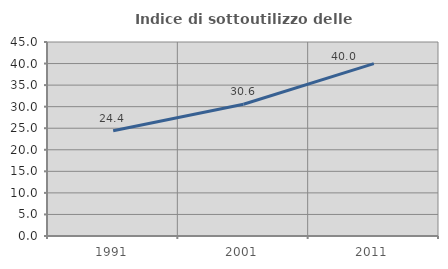
| Category | Indice di sottoutilizzo delle abitazioni  |
|---|---|
| 1991.0 | 24.392 |
| 2001.0 | 30.572 |
| 2011.0 | 39.983 |